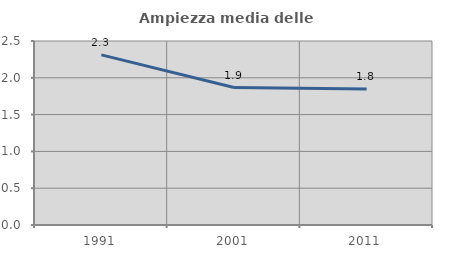
| Category | Ampiezza media delle famiglie |
|---|---|
| 1991.0 | 2.311 |
| 2001.0 | 1.868 |
| 2011.0 | 1.848 |